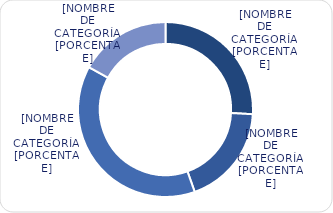
| Category | Series 0 |
|---|---|
| Entre 1-5 años | 4033 |
| Entre 6-10 años | 2919.1 |
| Entre 11-20 años | 5997.9 |
| Mayores de 20 años | 2645.8 |